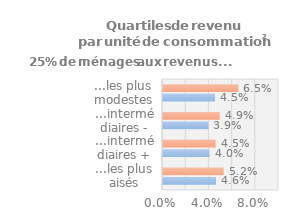
| Category | Series 0 | Series 1 |
|---|---|---|
| ...les plus aisés | 0.046 | 0.052 |
| ...intermédiaires + | 0.04 | 0.045 |
| ...intermédiaires - | 0.039 | 0.049 |
| ...les plus modestes | 0.045 | 0.065 |